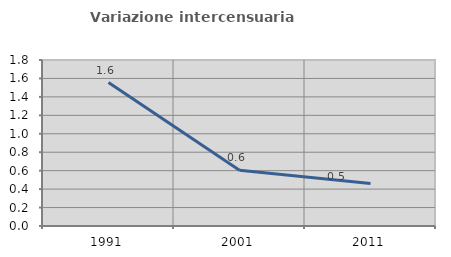
| Category | Variazione intercensuaria annua |
|---|---|
| 1991.0 | 1.555 |
| 2001.0 | 0.605 |
| 2011.0 | 0.46 |